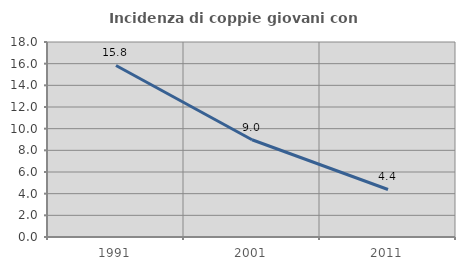
| Category | Incidenza di coppie giovani con figli |
|---|---|
| 1991.0 | 15.836 |
| 2001.0 | 8.975 |
| 2011.0 | 4.387 |